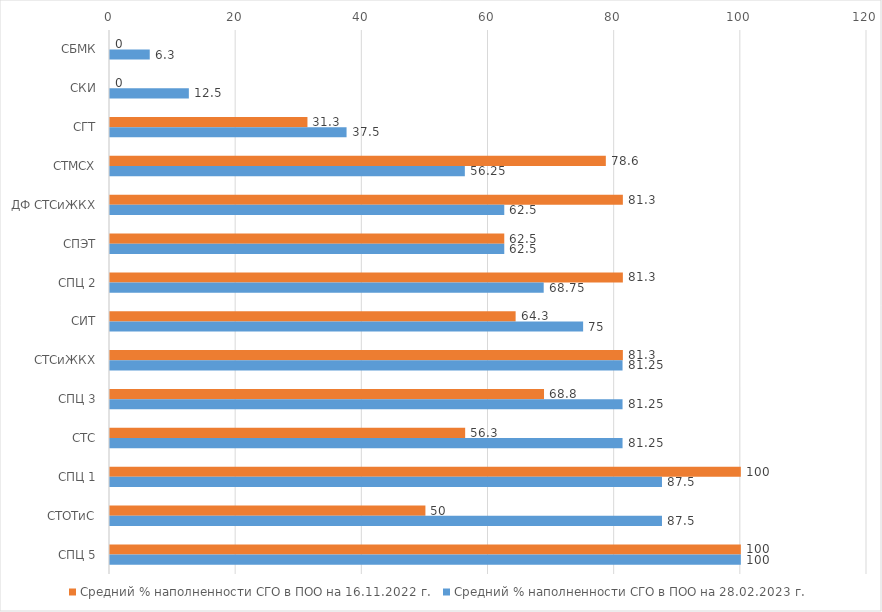
| Category | Средний % наполненности СГО в ПОО на 16.11.2022 г.  | Средний % наполненности СГО в ПОО на 28.02.2023 г.  |
|---|---|---|
| СБМК | 0 | 6.3 |
| СКИ | 0 | 12.5 |
| СГТ | 31.3 | 37.5 |
| СТМСХ | 78.6 | 56.25 |
| ДФ СТСиЖКХ | 81.3 | 62.5 |
| СПЭТ | 62.5 | 62.5 |
| СПЦ 2 | 81.3 | 68.75 |
| СИТ | 64.3 | 75 |
| СТСиЖКХ | 81.3 | 81.25 |
| СПЦ 3 | 68.8 | 81.25 |
| СТС | 56.3 | 81.25 |
| СПЦ 1 | 100 | 87.5 |
| СТОТиС | 50 | 87.5 |
| СПЦ 5 | 100 | 100 |